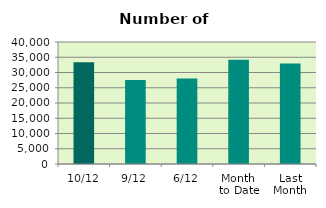
| Category | Series 0 |
|---|---|
| 10/12 | 33334 |
| 9/12 | 27510 |
| 6/12 | 28056 |
| Month 
to Date | 34214.857 |
| Last
Month | 32932.667 |